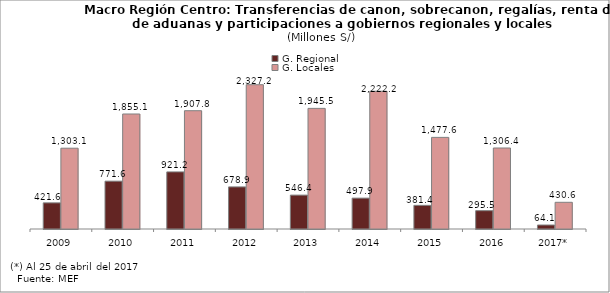
| Category | G. Regional | G. Locales |
|---|---|---|
| 2009 | 421.551 | 1303.148 |
| 2010 | 771.627 | 1855.086 |
| 2011 | 921.16 | 1907.77 |
| 2012 | 678.865 | 2327.249 |
| 2013 | 546.384 | 1945.545 |
| 2014 | 497.892 | 2222.199 |
| 2015 | 381.362 | 1477.604 |
| 2016 | 295.469 | 1306.393 |
| 2017* | 64.124 | 430.598 |